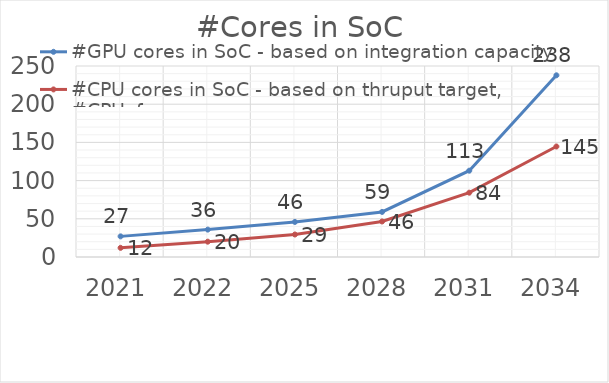
| Category | #GPU cores in SoC - based on integration capacity | #CPU cores in SoC - based on thruput target, #CPUxfmax |
|---|---|---|
| 2021.0 | 27 | 12 |
| 2022.0 | 35.859 | 20.064 |
| 2025.0 | 45.9 | 29.452 |
| 2028.0 | 59.014 | 46.499 |
| 2031.0 | 112.957 | 84.174 |
| 2034.0 | 237.804 | 144.628 |